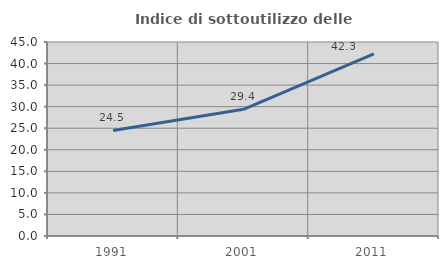
| Category | Indice di sottoutilizzo delle abitazioni  |
|---|---|
| 1991.0 | 24.493 |
| 2001.0 | 29.382 |
| 2011.0 | 42.263 |